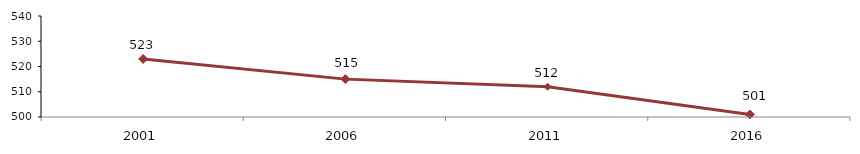
| Category | Interpréter et Apprécier |
|---|---|
| 2001.0 | 523 |
| 2006.0 | 515 |
| 2011.0 | 512 |
| 2016.0 | 501 |